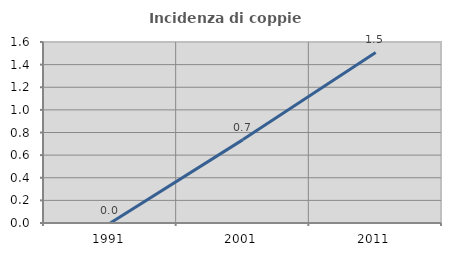
| Category | Incidenza di coppie miste |
|---|---|
| 1991.0 | 0 |
| 2001.0 | 0.737 |
| 2011.0 | 1.508 |